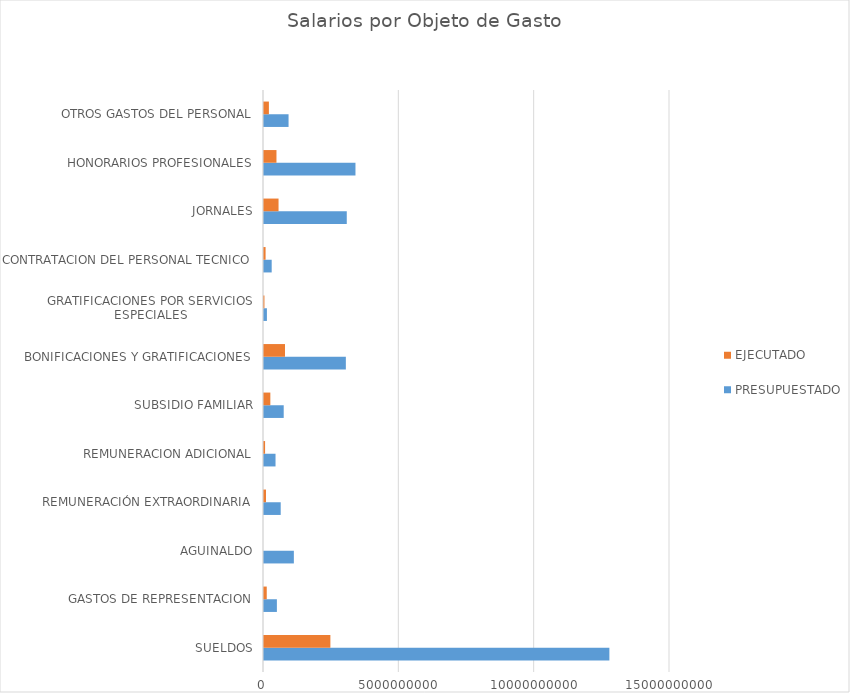
| Category | PRESUPUESTADO | EJECUTADO |
|---|---|---|
| SUELDOS | 12760347408 | 2452601604 |
| GASTOS DE REPRESENTACION | 476214000 | 101401000 |
| AGUINALDO | 1103046784 | 0 |
| REMUNERACIÓN EXTRAORDINARIA | 617333416 | 74324716 |
| REMUNERACION ADICIONAL | 425863008 | 39791496 |
| SUBSIDIO FAMILIAR | 728300000 | 234221724 |
| BONIFICACIONES Y GRATIFICACIONES | 3024010080 | 776337240 |
| GRATIFICACIONES POR SERVICIOS ESPECIALES | 108000000 | 16200000 |
| CONTRATACION DEL PERSONAL TECNICO | 284075000 | 58281398 |
| JORNALES | 3058157615 | 537521904 |
| HONORARIOS PROFESIONALES | 3379469520 | 460690957 |
| OTROS GASTOS DEL PERSONAL | 907314364 | 180863154 |